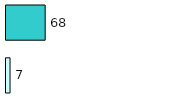
| Category | Series 0 | Series 1 |
|---|---|---|
| 0 | 7 | 68 |